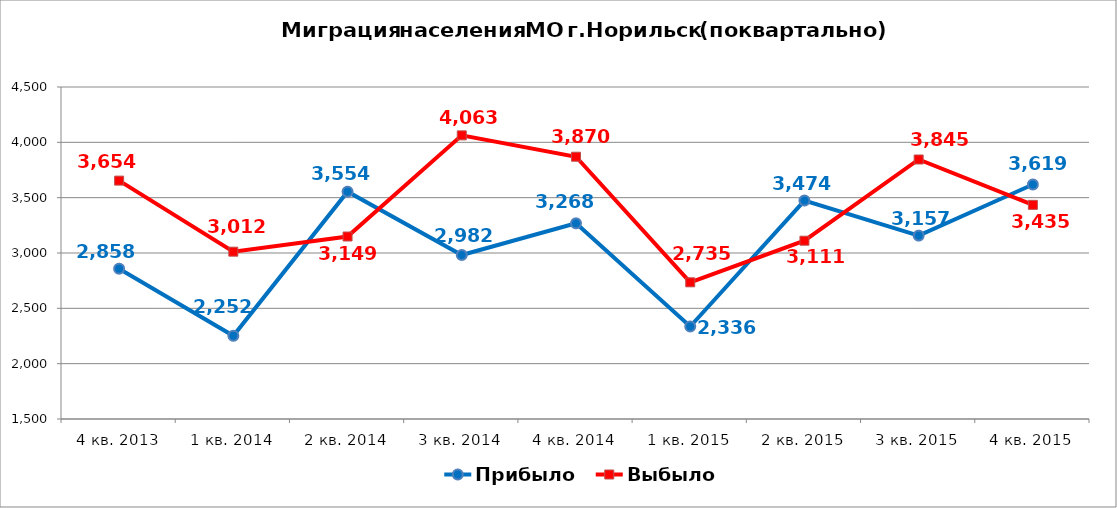
| Category | Прибыло | Выбыло |
|---|---|---|
| 4 кв. 2013 | 2858 | 3654 |
| 1 кв. 2014 | 2252 | 3012 |
| 2 кв. 2014 | 3554 | 3149 |
| 3 кв. 2014 | 2982 | 4063 |
| 4 кв. 2014 | 3268 | 3870 |
| 1 кв. 2015 | 2336 | 2735 |
| 2 кв. 2015 | 3474 | 3111 |
| 3 кв. 2015 | 3157 | 3845 |
| 4 кв. 2015 | 3619 | 3435 |